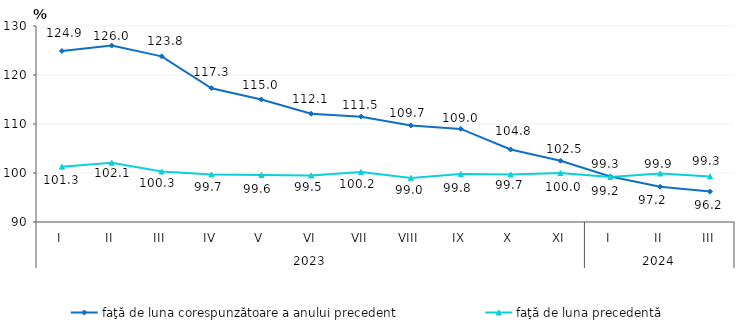
| Category | faţă de luna corespunzătoare a anului precedent | faţă de luna precedentă   |
|---|---|---|
| 0 | 124.9 | 101.3 |
| 1 | 126 | 102.1 |
| 2 | 123.8 | 100.3 |
| 3 | 117.3 | 99.7 |
| 4 | 115 | 99.6 |
| 5 | 112.1 | 99.5 |
| 6 | 111.5 | 100.2 |
| 7 | 109.7 | 99 |
| 8 | 109 | 99.8 |
| 9 | 104.8 | 99.7 |
| 10 | 102.5 | 100 |
| 11 | 99.3 | 99.2 |
| 12 | 97.2 | 99.9 |
| 13 | 96.2 | 99.3 |